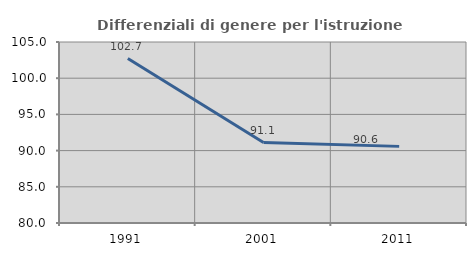
| Category | Differenziali di genere per l'istruzione superiore |
|---|---|
| 1991.0 | 102.707 |
| 2001.0 | 91.107 |
| 2011.0 | 90.584 |